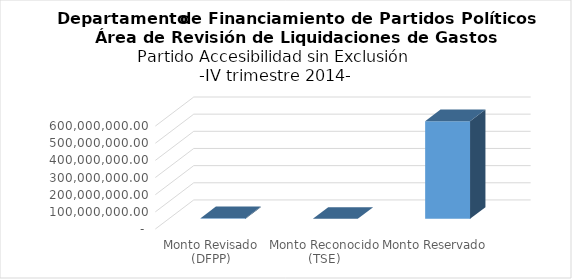
| Category | Series 0 |
|---|---|
| Monto Revisado (DFPP) | 3827015.23 |
| Monto Reconocido (TSE) | 0 |
| Monto Reservado  | 568861574.35 |